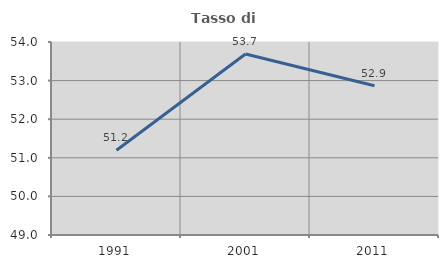
| Category | Tasso di occupazione   |
|---|---|
| 1991.0 | 51.195 |
| 2001.0 | 53.689 |
| 2011.0 | 52.865 |